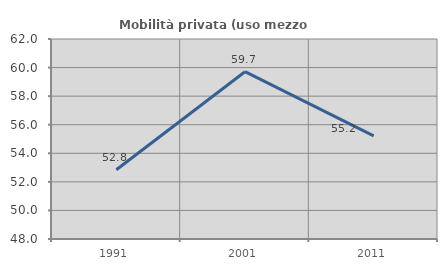
| Category | Mobilità privata (uso mezzo privato) |
|---|---|
| 1991.0 | 52.845 |
| 2001.0 | 59.71 |
| 2011.0 | 55.214 |